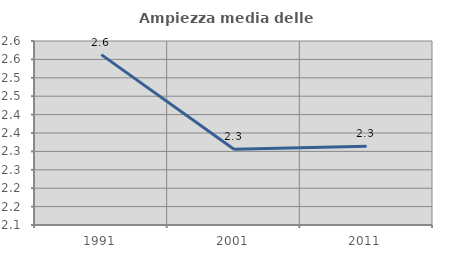
| Category | Ampiezza media delle famiglie |
|---|---|
| 1991.0 | 2.563 |
| 2001.0 | 2.306 |
| 2011.0 | 2.314 |